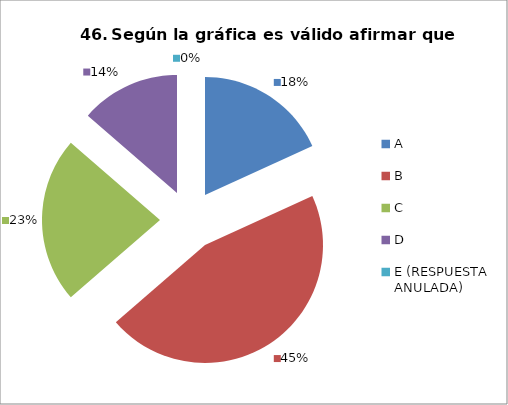
| Category | CANTIDAD DE RESPUESTAS PREGUNTA (46) | PORCENTAJE |
|---|---|---|
| A | 4 | 0.182 |
| B | 10 | 0.455 |
| C | 5 | 0.227 |
| D | 3 | 0.136 |
| E (RESPUESTA ANULADA) | 0 | 0 |